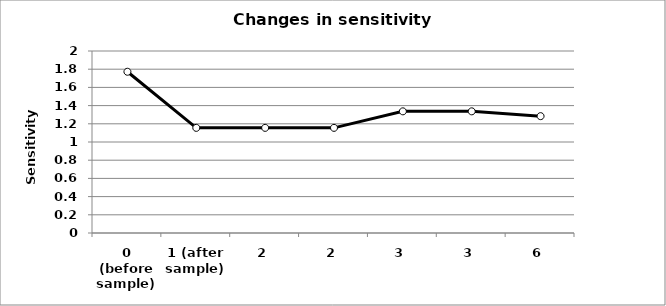
| Category | Sensitivity [V/µM] |
|---|---|
| 0 (before sample) | 1.772 |
| 1 (after sample) | 1.155 |
| 2 | 1.155 |
| 2 | 1.155 |
| 3 | 1.337 |
| 3 | 1.337 |
| 6 | 1.284 |